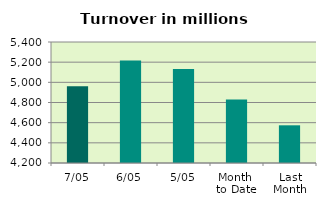
| Category | Series 0 |
|---|---|
| 7/05 | 4961.283 |
| 6/05 | 5216.259 |
| 5/05 | 5133.373 |
| Month 
to Date | 4828.835 |
| Last
Month | 4573.802 |